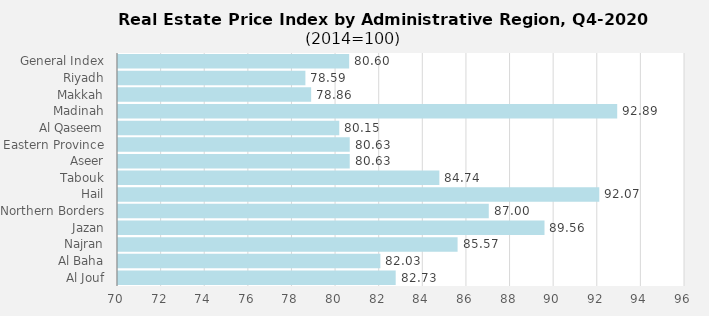
| Category | 2020 |
|---|---|
| General Index | 80.6 |
| Riyadh | 78.593 |
| Makkah | 78.857 |
| Madinah | 92.891 |
| Al Qaseem | 80.146 |
| Eastern Province | 80.626 |
| Aseer | 80.626 |
| Tabouk | 84.735 |
| Hail | 92.069 |
| Northern Borders | 87.002 |
| Jazan | 89.557 |
| Najran | 85.572 |
| Al Baha | 82.031 |
| Al Jouf | 82.734 |